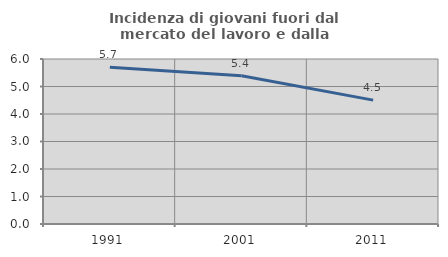
| Category | Incidenza di giovani fuori dal mercato del lavoro e dalla formazione  |
|---|---|
| 1991.0 | 5.702 |
| 2001.0 | 5.392 |
| 2011.0 | 4.505 |